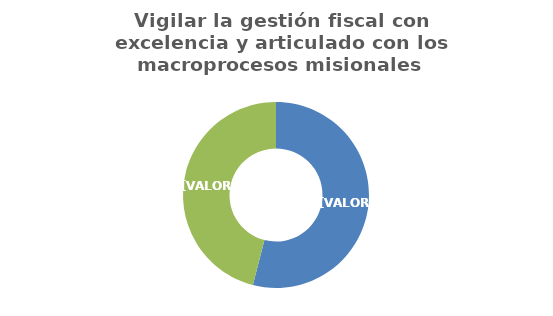
| Category | Vigilar la gestión fiscal con excelencia y articulado con los macroprocesos misionales |
|---|---|
| Avance 1° Semestre
(ejecución acumulada a junio de 2020) | 0.54 |
| Diferencia
(ejecución faltante para completar la meta establecida) | 0.46 |